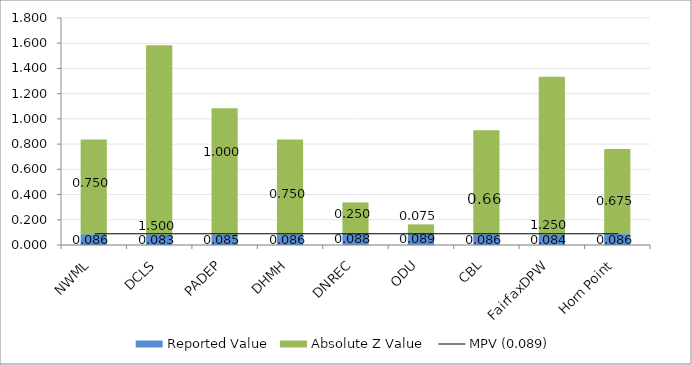
| Category | Reported Value | Absolute Z Value  |
|---|---|---|
| NWML | 0.086 | 0.75 |
| DCLS | 0.083 | 1.5 |
| PADEP | 0.085 | 1 |
| DHMH | 0.086 | 0.75 |
| DNREC | 0.088 | 0.25 |
| ODU | 0.089 | 0.075 |
| CBL | 0.086 | 0.825 |
| FairfaxDPW | 0.084 | 1.25 |
| Horn Point | 0.086 | 0.675 |